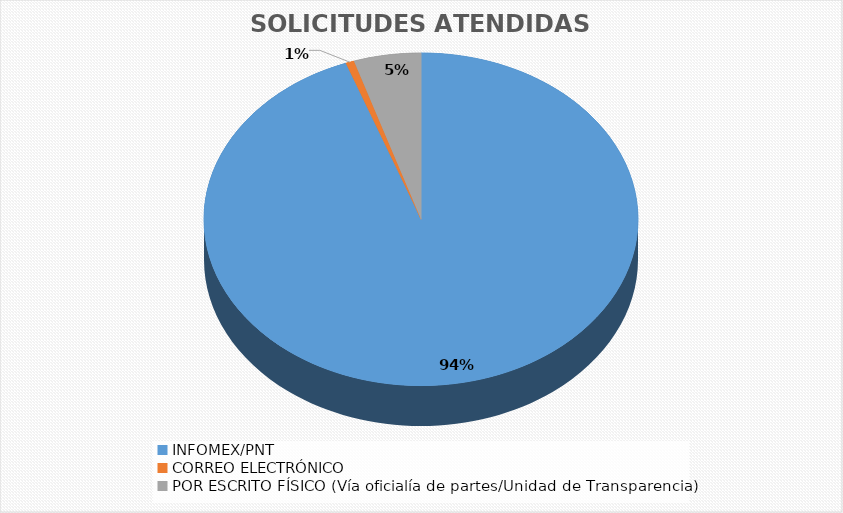
| Category | Series 0 |
|---|---|
| INFOMEX/PNT | 2228 |
| CORREO ELECTRÓNICO | 15 |
| POR ESCRITO FÍSICO (Vía oficialía de partes/Unidad de Transparencia) | 118 |